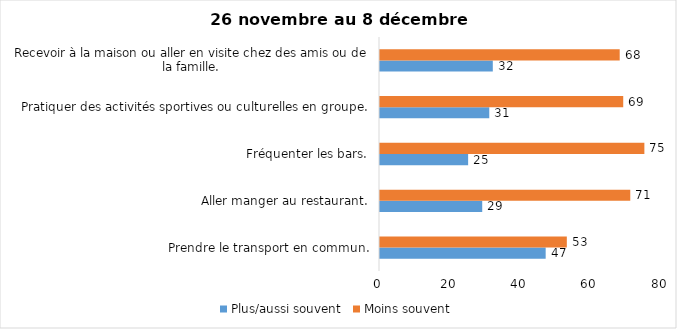
| Category | Plus/aussi souvent | Moins souvent |
|---|---|---|
| Prendre le transport en commun. | 47 | 53 |
| Aller manger au restaurant. | 29 | 71 |
| Fréquenter les bars. | 25 | 75 |
| Pratiquer des activités sportives ou culturelles en groupe. | 31 | 69 |
| Recevoir à la maison ou aller en visite chez des amis ou de la famille. | 32 | 68 |